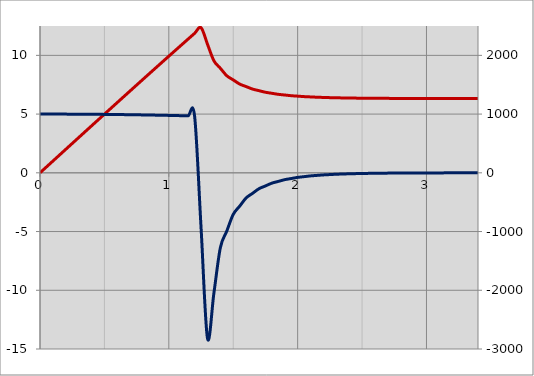
| Category | Series 0 |
|---|---|
| 0.0 | 0 |
| 0.05 | 0.5 |
| 0.1 | 1 |
| 0.15000000000000002 | 1.5 |
| 0.2 | 2 |
| 0.25 | 2.499 |
| 0.3 | 2.999 |
| 0.35 | 3.498 |
| 0.39999999999999997 | 3.996 |
| 0.44999999999999996 | 4.495 |
| 0.49999999999999994 | 4.992 |
| 0.5499999999999999 | 5.49 |
| 0.6 | 5.986 |
| 0.65 | 6.482 |
| 0.7000000000000001 | 6.977 |
| 0.7500000000000001 | 7.472 |
| 0.8000000000000002 | 7.965 |
| 0.8500000000000002 | 8.458 |
| 0.9000000000000002 | 8.949 |
| 0.9500000000000003 | 9.44 |
| 1.0000000000000002 | 9.929 |
| 1.0500000000000003 | 10.418 |
| 1.1000000000000003 | 10.904 |
| 1.1500000000000004 | 11.39 |
| 1.2000000000000004 | 11.874 |
| 1.2500000000000004 | 12.358 |
| 1.3000000000000005 | 10.949 |
| 1.3500000000000005 | 9.54 |
| 1.4000000000000006 | 8.902 |
| 1.4500000000000006 | 8.265 |
| 1.5000000000000007 | 7.911 |
| 1.5500000000000007 | 7.557 |
| 1.6000000000000008 | 7.343 |
| 1.6500000000000008 | 7.129 |
| 1.7000000000000008 | 6.994 |
| 1.7500000000000009 | 6.859 |
| 1.800000000000001 | 6.771 |
| 1.850000000000001 | 6.683 |
| 1.900000000000001 | 6.624 |
| 1.950000000000001 | 6.566 |
| 2.000000000000001 | 6.527 |
| 2.0500000000000007 | 6.488 |
| 2.1000000000000005 | 6.462 |
| 2.1500000000000004 | 6.436 |
| 2.2 | 6.418 |
| 2.25 | 6.4 |
| 2.3 | 6.388 |
| 2.3499999999999996 | 6.376 |
| 2.3999999999999995 | 6.368 |
| 2.4499999999999993 | 6.36 |
| 2.499999999999999 | 6.354 |
| 2.549999999999999 | 6.349 |
| 2.5999999999999988 | 6.345 |
| 2.6499999999999986 | 6.341 |
| 2.6999999999999984 | 6.338 |
| 2.7499999999999982 | 6.336 |
| 2.799999999999998 | 6.334 |
| 2.849999999999998 | 6.332 |
| 2.8999999999999977 | 6.331 |
| 2.9499999999999975 | 6.33 |
| 2.9999999999999973 | 6.329 |
| 3.049999999999997 | 6.328 |
| 3.099999999999997 | 6.328 |
| 3.149999999999997 | 6.327 |
| 3.1999999999999966 | 6.327 |
| 3.2499999999999964 | 6.326 |
| 3.2999999999999963 | 6.326 |
| 3.349999999999996 | 6.326 |
| 3.399999999999996 | 6.326 |